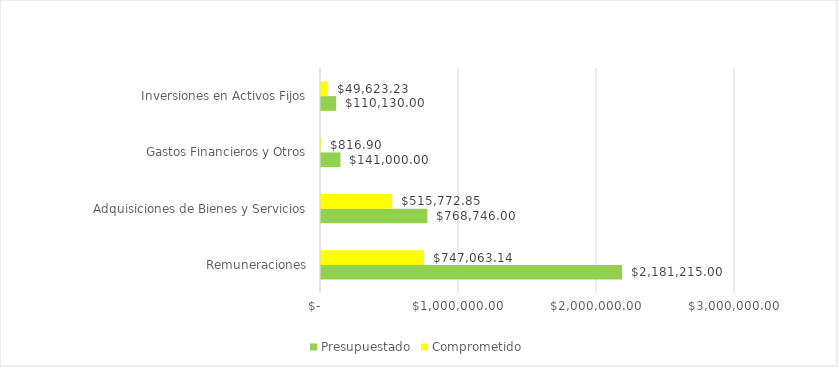
| Category |  Presupuestado  |  Comprometido  |
|---|---|---|
| Remuneraciones | 2181215 | 747063.14 |
| Adquisiciones de Bienes y Servicios | 768746 | 515772.85 |
| Gastos Financieros y Otros | 141000 | 816.9 |
| Inversiones en Activos Fijos | 110130 | 49623.23 |